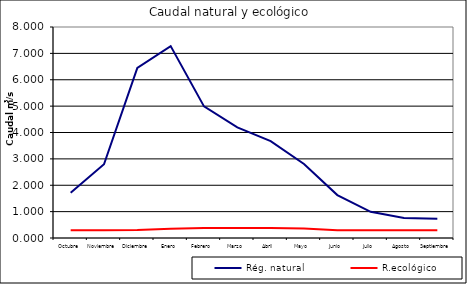
| Category | Rég. natural | R.ecológico |
|---|---|---|
| Octubre | 1.713 | 0.296 |
| Noviembre | 2.798 | 0.296 |
| Diciembre | 6.447 | 0.299 |
| Enero | 7.276 | 0.346 |
| Febrero | 4.991 | 0.38 |
| Marzo | 4.194 | 0.381 |
| Abril | 3.672 | 0.38 |
| Mayo | 2.805 | 0.363 |
| Junio | 1.627 | 0.296 |
| Julio | 0.992 | 0.296 |
| Agosto | 0.763 | 0.296 |
| Septiembre | 0.73 | 0.296 |